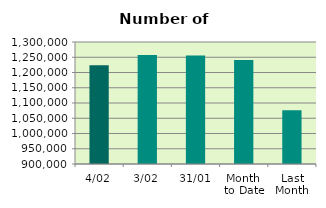
| Category | Series 0 |
|---|---|
| 4/02 | 1223612 |
| 3/02 | 1257558 |
| 31/01 | 1255646 |
| Month 
to Date | 1240585 |
| Last
Month | 1075899.909 |